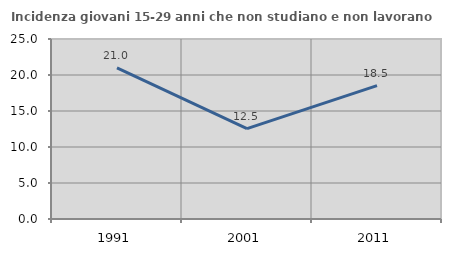
| Category | Incidenza giovani 15-29 anni che non studiano e non lavorano  |
|---|---|
| 1991.0 | 20.998 |
| 2001.0 | 12.542 |
| 2011.0 | 18.519 |